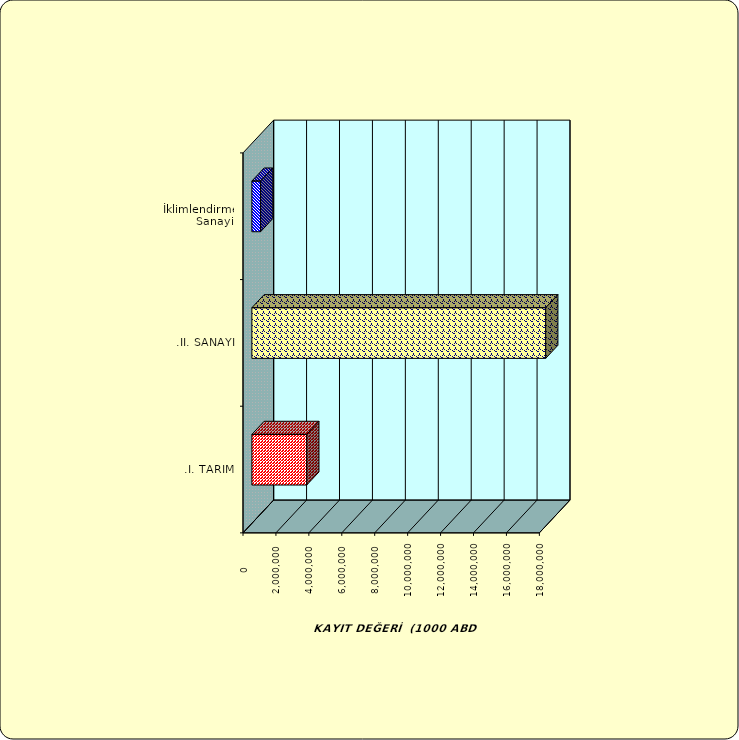
| Category | Series 0 |
|---|---|
| .I. TARIM | 3332058.817 |
| .II. SANAYİ | 17845579.029 |
|  İklimlendirme Sanayii | 529079.502 |